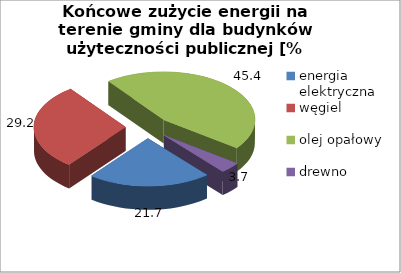
| Category | energia elektryczna węgiel olej opałowy drewno |
|---|---|
| energia elektryczna | 21.672 |
| węgiel | 29.211 |
| olej opałowy | 45.397 |
| drewno | 3.72 |